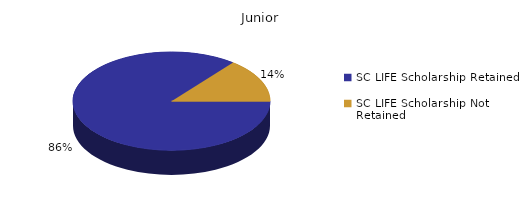
| Category | Junior |
|---|---|
| SC LIFE Scholarship Retained  | 1729 |
| SC LIFE Scholarship Not Retained  | 289 |